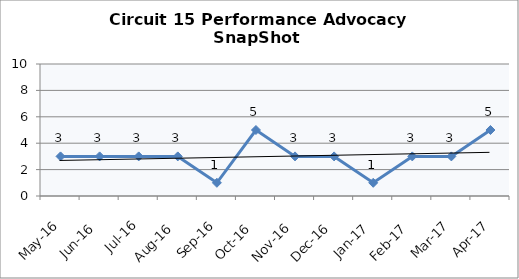
| Category | Circuit 15 |
|---|---|
| May-16 | 3 |
| Jun-16 | 3 |
| Jul-16 | 3 |
| Aug-16 | 3 |
| Sep-16 | 1 |
| Oct-16 | 5 |
| Nov-16 | 3 |
| Dec-16 | 3 |
| Jan-17 | 1 |
| Feb-17 | 3 |
| Mar-17 | 3 |
| Apr-17 | 5 |